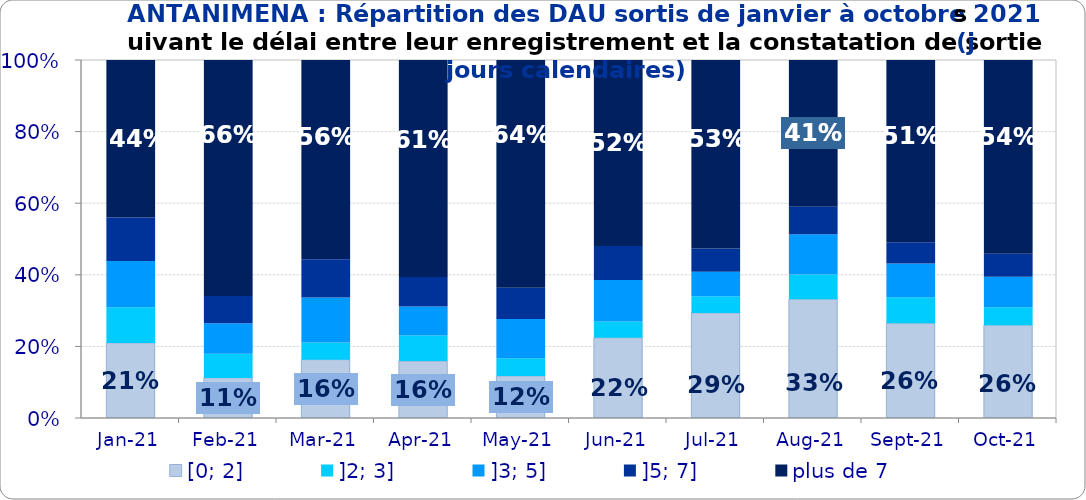
| Category | [0; 2] | ]2; 3] | ]3; 5] | ]5; 7] | plus de 7 |
|---|---|---|---|---|---|
| 2021-01-01 | 0.21 | 0.1 | 0.129 | 0.122 | 0.44 |
| 2021-02-01 | 0.112 | 0.068 | 0.085 | 0.076 | 0.659 |
| 2021-03-01 | 0.163 | 0.048 | 0.126 | 0.106 | 0.557 |
| 2021-04-01 | 0.159 | 0.072 | 0.081 | 0.082 | 0.606 |
| 2021-05-01 | 0.117 | 0.05 | 0.11 | 0.087 | 0.636 |
| 2021-06-01 | 0.224 | 0.046 | 0.115 | 0.096 | 0.519 |
| 2021-07-01 | 0.293 | 0.047 | 0.069 | 0.065 | 0.527 |
| 2021-08-01 | 0.332 | 0.069 | 0.113 | 0.077 | 0.41 |
| 2021-09-01 | 0.264 | 0.073 | 0.094 | 0.06 | 0.509 |
| 2021-10-01 | 0.259 | 0.05 | 0.085 | 0.064 | 0.541 |